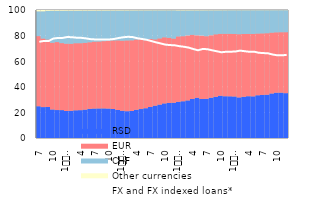
| Category | RSD | EUR | CHF | Other currencies |
|---|---|---|---|---|
| 7 | 24.818 | 54.789 | 19.339 | 1.053 |
| 8 | 24.149 | 53.574 | 21.245 | 1.032 |
| 9 | 24.248 | 52.694 | 22.376 | 0.682 |
| 10 | 22.302 | 52.149 | 24.932 | 0.617 |
| 11 | 21.845 | 53.099 | 24.433 | 0.623 |
| 12 | 21.796 | 52.34 | 25.262 | 0.602 |
| 1
2009 | 21.095 | 52.607 | 25.716 | 0.582 |
| 2 | 21.263 | 52.362 | 25.804 | 0.57 |
| 3 | 21.645 | 52.421 | 25.368 | 0.566 |
| 4 | 21.754 | 52.32 | 25.383 | 0.544 |
| 5 | 22.183 | 52.161 | 25.127 | 0.529 |
| 6 | 22.779 | 52.029 | 24.664 | 0.528 |
| 7 | 23.011 | 52.267 | 24.206 | 0.516 |
| 8 | 23.089 | 52.296 | 24.11 | 0.505 |
| 9 | 23.123 | 52.545 | 23.84 | 0.492 |
| 10 | 23.01 | 53.022 | 23.493 | 0.475 |
| 11 | 22.652 | 53.559 | 23.327 | 0.462 |
| 12 | 21.871 | 54.409 | 23.264 | 0.456 |
| 1
2010 | 21.306 | 54.749 | 23.503 | 0.442 |
| 2 | 20.944 | 55.283 | 23.341 | 0.431 |
| 3 | 21.147 | 55.192 | 23.259 | 0.403 |
| 4 | 22.066 | 54.88 | 22.667 | 0.387 |
| 5 | 22.629 | 54.547 | 22.447 | 0.377 |
| 6 | 23.264 | 53.15 | 23.229 | 0.357 |
| 7 | 24.25 | 53.111 | 22.293 | 0.346 |
| 8 | 25.268 | 51.803 | 22.599 | 0.33 |
| 9 | 26.112 | 51.715 | 21.852 | 0.321 |
| 10 | 27.025 | 51.644 | 21.024 | 0.306 |
| 11 | 27.405 | 50.882 | 21.42 | 0.293 |
| 12 | 27.553 | 50.158 | 22.001 | 0.288 |
| 1
2011 | 28.269 | 51.116 | 20.189 | 0.426 |
| 2 | 28.712 | 50.828 | 20.039 | 0.421 |
| 3 | 29.374 | 50.783 | 19.44 | 0.404 |
| 4 | 30.501 | 50.11 | 19.006 | 0.383 |
| 5 | 31.469 | 48.767 | 19.392 | 0.372 |
| 6 | 30.472 | 49.552 | 19.617 | 0.359 |
| 7 | 30.617 | 48.914 | 20.131 | 0.338 |
| 8 | 31.466 | 48.821 | 19.381 | 0.333 |
| 9 | 32.205 | 48.824 | 18.653 | 0.318 |
| 10 | 33.017 | 48.366 | 18.317 | 0.301 |
| 11 | 32.626 | 48.776 | 18.297 | 0.3 |
| 12 | 32.567 | 48.83 | 18.362 | 0.241 |
| 1
2012 | 32.447 | 48.832 | 18.486 | 0.235 |
| 2 | 31.713 | 49.385 | 18.667 | 0.234 |
| 3 | 32.192 | 49.056 | 18.523 | 0.229 |
| 4 | 32.643 | 48.693 | 18.439 | 0.225 |
| 5 | 32.539 | 48.784 | 18.456 | 0.222 |
| 6 | 33.392 | 48.224 | 18.168 | 0.216 |
| 7 | 33.65 | 48.09 | 18.047 | 0.213 |
| 8 | 33.829 | 48.042 | 17.919 | 0.21 |
| 9 | 34.792 | 47.54 | 17.468 | 0.199 |
| 10 | 35.398 | 47.171 | 17.239 | 0.193 |
| 11 | 35.436 | 47.221 | 17.157 | 0.186 |
| 12 | 35.032 | 47.639 | 17.142 | 0.187 |